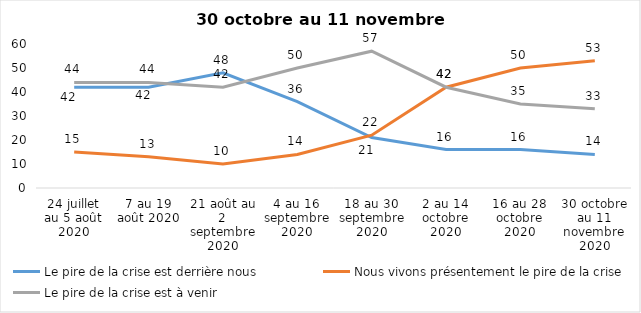
| Category | Le pire de la crise est derrière nous | Nous vivons présentement le pire de la crise | Le pire de la crise est à venir |
|---|---|---|---|
| 24 juillet au 5 août 2020 | 42 | 15 | 44 |
| 7 au 19 août 2020 | 42 | 13 | 44 |
| 21 août au 2 septembre 2020 | 48 | 10 | 42 |
| 4 au 16 septembre 2020 | 36 | 14 | 50 |
| 18 au 30 septembre 2020 | 21 | 22 | 57 |
| 2 au 14 octobre 2020 | 16 | 42 | 42 |
| 16 au 28 octobre 2020 | 16 | 50 | 35 |
| 30 octobre au 11 novembre 2020 | 14 | 53 | 33 |